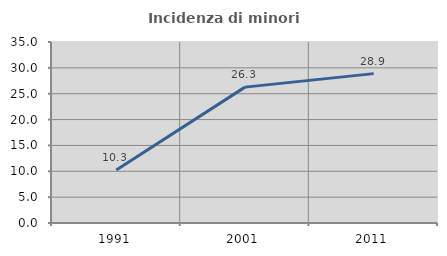
| Category | Incidenza di minori stranieri |
|---|---|
| 1991.0 | 10.256 |
| 2001.0 | 26.275 |
| 2011.0 | 28.884 |